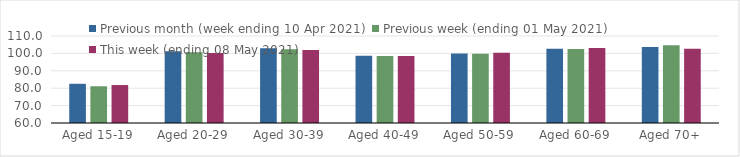
| Category | Previous month (week ending 10 Apr 2021) | Previous week (ending 01 May 2021) | This week (ending 08 May 2021) |
|---|---|---|---|
| Aged 15-19 | 82.54 | 81.11 | 81.82 |
| Aged 20-29 | 101.21 | 100.63 | 100.29 |
| Aged 30-39 | 102.97 | 102.39 | 101.99 |
| Aged 40-49 | 98.66 | 98.44 | 98.55 |
| Aged 50-59 | 99.94 | 99.82 | 100.32 |
| Aged 60-69 | 102.62 | 102.55 | 103.07 |
| Aged 70+ | 103.64 | 104.65 | 102.73 |